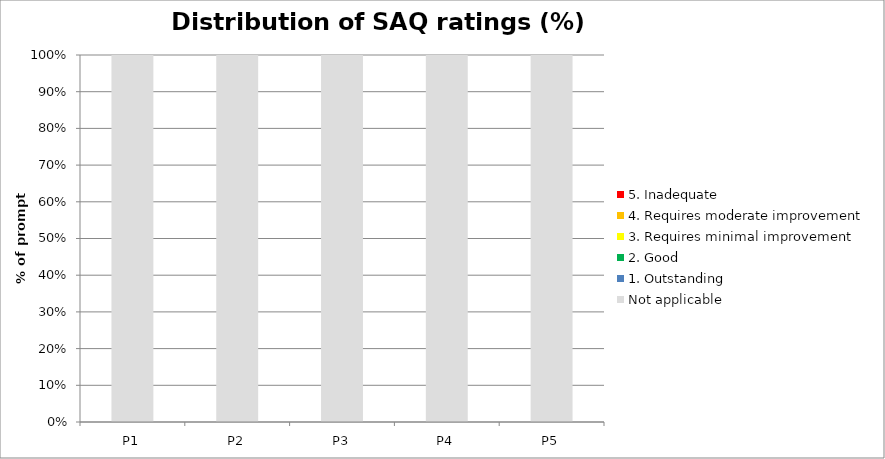
| Category | Not applicable | 1. Outstanding | 2. Good | 3. Requires minimal improvement | 4. Requires moderate improvement | 5. Inadequate |
|---|---|---|---|---|---|---|
| P1 | 1 | 0 | 0 | 0 | 0 | 0 |
| P2 | 1 | 0 | 0 | 0 | 0 | 0 |
| P3 | 1 | 0 | 0 | 0 | 0 | 0 |
| P4 | 1 | 0 | 0 | 0 | 0 | 0 |
| P5 | 1 | 0 | 0 | 0 | 0 | 0 |